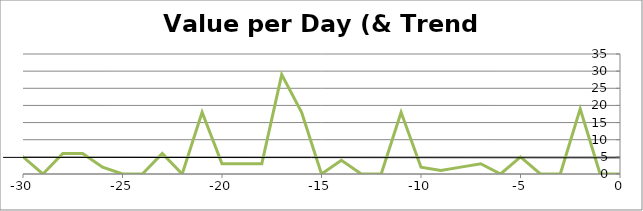
| Category | Series 2 |
|---|---|
| -31.0 | 0 |
| -30.0 | 5 |
| -29.0 | 0 |
| -28.0 | 6 |
| -27.0 | 6 |
| -26.0 | 2 |
| -25.0 | 0 |
| -24.0 | 0 |
| -23.0 | 6 |
| -22.0 | 0 |
| -21.0 | 18 |
| -20.0 | 3 |
| -19.0 | 3 |
| -18.0 | 3 |
| -17.0 | 29 |
| -16.0 | 18 |
| -15.0 | 0 |
| -14.0 | 4 |
| -13.0 | 0 |
| -12.0 | 0 |
| -11.0 | 18 |
| -10.0 | 2 |
| -9.0 | 1 |
| -8.0 | 2 |
| -7.0 | 3 |
| -6.0 | 0 |
| -5.0 | 5 |
| -4.0 | 0 |
| -3.0 | 0 |
| -2.0 | 19 |
| -1.0 | 0 |
| 0.0 | 0 |